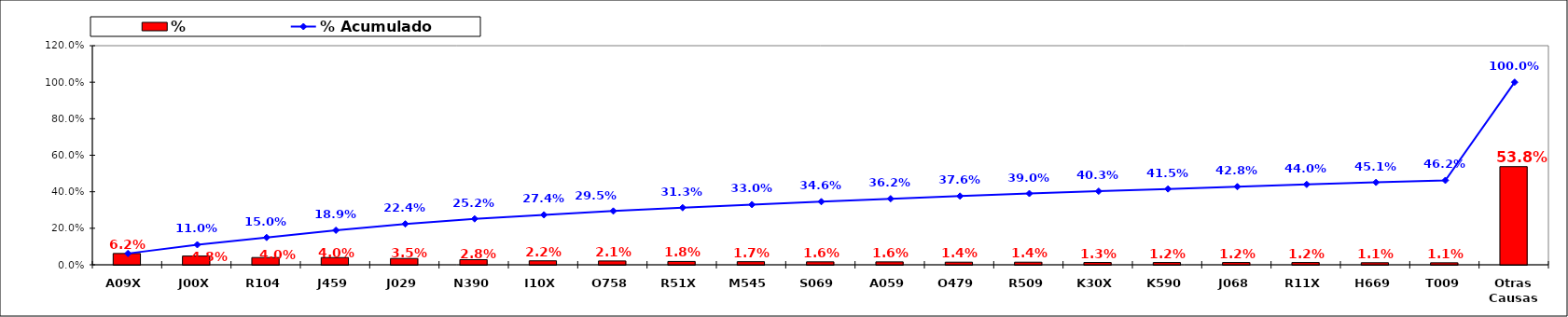
| Category | % |
|---|---|
| A09X | 0.062 |
| J00X | 0.048 |
| R104 | 0.04 |
| J459 | 0.04 |
| J029 | 0.035 |
| N390 | 0.028 |
| I10X | 0.022 |
| O758 | 0.021 |
| R51X | 0.018 |
| M545 | 0.017 |
| S069 | 0.016 |
| A059 | 0.016 |
| O479 | 0.014 |
| R509 | 0.014 |
| K30X | 0.013 |
| K590 | 0.012 |
| J068 | 0.012 |
| R11X | 0.012 |
| H669 | 0.011 |
| T009 | 0.011 |
| Otras Causas | 0.538 |